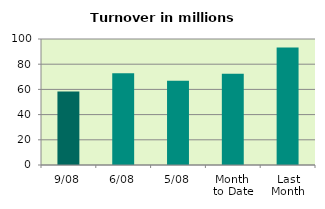
| Category | Series 0 |
|---|---|
| 9/08 | 58.336 |
| 6/08 | 72.771 |
| 5/08 | 66.925 |
| Month 
to Date | 72.355 |
| Last
Month | 93.279 |